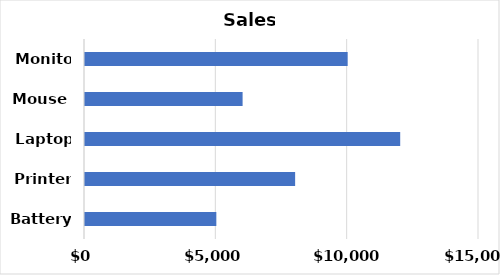
| Category | Sales |
|---|---|
| Battery | 5000 |
| Printer | 8000 |
| Laptop | 12000 |
| Mouse | 6000 |
| Monitor | 10000 |